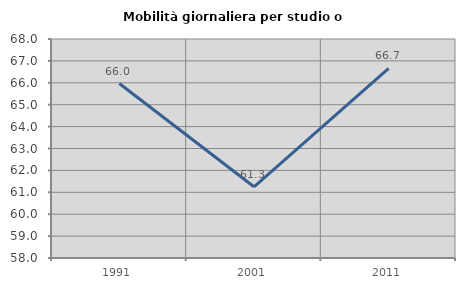
| Category | Mobilità giornaliera per studio o lavoro |
|---|---|
| 1991.0 | 65.967 |
| 2001.0 | 61.252 |
| 2011.0 | 66.661 |